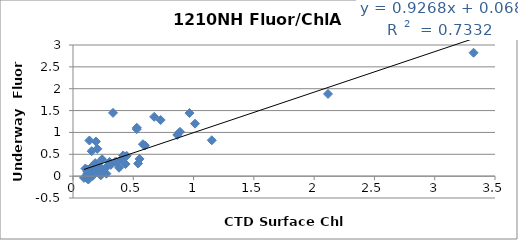
| Category | Series 0 |
|---|---|
| 0.282 | 0.218 |
| 0.416 | 0.473 |
| 0.887 | 1.014 |
| 0.221 | 0.051 |
| 0.175 | 0.167 |
| 0.242 | 0.156 |
| 0.193 | 0.154 |
| 0.217 | 0.095 |
| 0.177 | 0.049 |
| 0.23 | 0.017 |
| 0.277 | 0.057 |
| 0.241 | 0.387 |
| 0.186 | 0.167 |
| 0.208 | 0.113 |
| 0.127 | -0.078 |
| 0.091 | -0.04 |
| 0.159 | 0.222 |
| 0.119 | -0.039 |
| 0.114 | -0.047 |
| 0.119 | 0.053 |
| 0.232 | 0.161 |
| 0.164 | 0.008 |
| 0.144 | 0.18 |
| 0.436 | 0.277 |
| 0.172 | 0.073 |
| 0.145 | 0.128 |
| 0.865 | 0.943 |
| 0.597 | 0.701 |
| 0.303 | 0.324 |
| 1.012 | 1.2 |
| 0.349 | 0.325 |
| 0.167 | 0.074 |
| 0.203 | 0.27 |
| 0.134 | 0.101 |
| 0.673 | 1.356 |
| 0.175 | 0.144 |
| 0.399 | 0.38 |
| 0.529 | 1.107 |
| 0.12 | 0.15 |
| 0.192 | 0.181 |
| 0.12 | 0.103 |
| 0.158 | 0.146 |
| 0.126 | 0.126 |
| 0.125 | -0.009 |
| 0.139 | 0.069 |
| 0.147 | 0.095 |
| 0.143 | 0.09 |
| 0.314 | 0.258 |
| 0.445 | 0.465 |
| 0.184 | 0.299 |
| 0.58 | 0.73 |
| 0.54 | 0.288 |
| 1.151 | 0.821 |
| 0.382 | 0.192 |
| 0.552 | 0.394 |
| 0.362 | 0.324 |
| 2.115 | 1.88 |
| 3.322 | 2.823 |
| 0.103 | 0.175 |
| 0.202 | 0.625 |
| 0.155 | 0.572 |
| 0.19 | 0.792 |
| 0.136 | 0.816 |
| 0.529 | 1.075 |
| 0.966 | 1.443 |
| 0.727 | 1.284 |
| 0.332 | 1.448 |